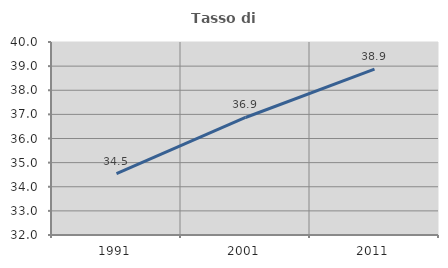
| Category | Tasso di occupazione   |
|---|---|
| 1991.0 | 34.543 |
| 2001.0 | 36.871 |
| 2011.0 | 38.878 |